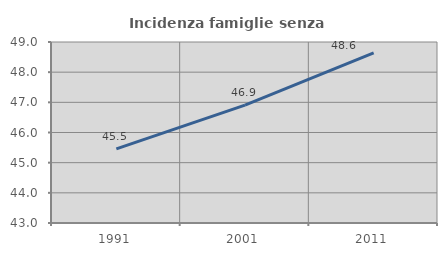
| Category | Incidenza famiglie senza nuclei |
|---|---|
| 1991.0 | 45.455 |
| 2001.0 | 46.91 |
| 2011.0 | 48.641 |